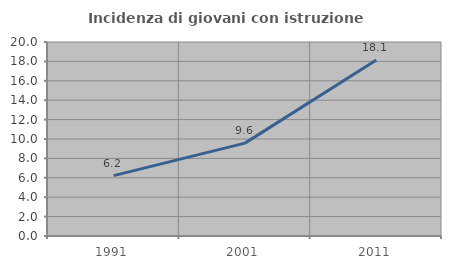
| Category | Incidenza di giovani con istruzione universitaria |
|---|---|
| 1991.0 | 6.22 |
| 2001.0 | 9.574 |
| 2011.0 | 18.138 |